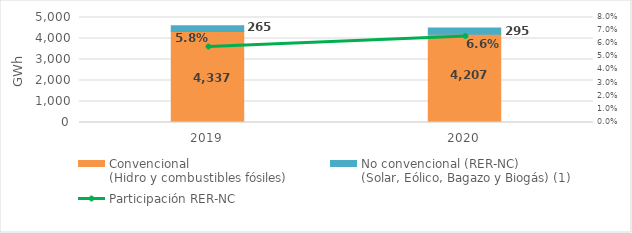
| Category | Convencional
(Hidro y combustibles fósiles) | No convencional (RER-NC)
(Solar, Eólico, Bagazo y Biogás) (1) |
|---|---|---|
| 2019.0 | 4336.717 | 264.715 |
| 2020.0 | 4207.214 | 295.024 |